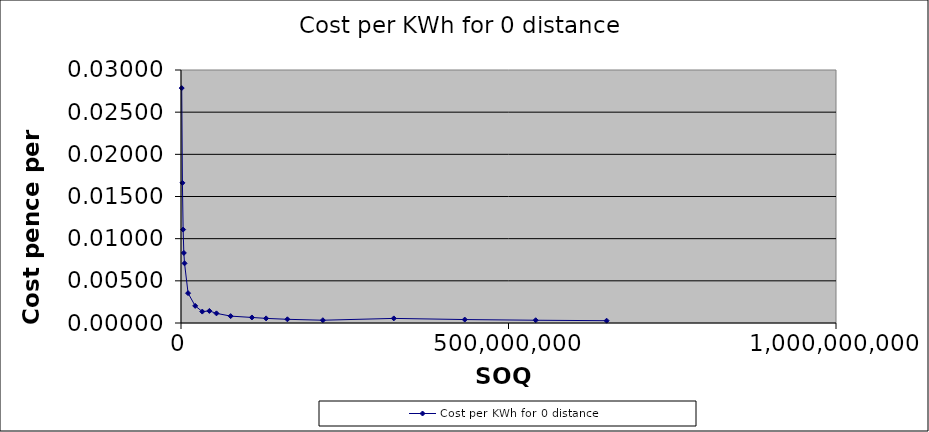
| Category | Cost per KWh for 0 distance |
|---|---|
| 649800000.0 | 0 |
| 541500000.0 | 0 |
| 433200000.0 | 0 |
| 324900000.0 | 0.001 |
| 216600000.0 | 0 |
| 162450000.0 | 0 |
| 129960000.0 | 0.001 |
| 108300000.0 | 0.001 |
| 75810000.0 | 0.001 |
| 54150000.0 | 0.001 |
| 43320000.0 | 0.001 |
| 32490000.0 | 0.001 |
| 21660000.0 | 0.002 |
| 10830000.0 | 0.004 |
| 5415000.0 | 0.007 |
| 4332000.0 | 0.008 |
| 3249000.0 | 0.011 |
| 2166000.0 | 0.017 |
| 1083000.0 | 0.028 |